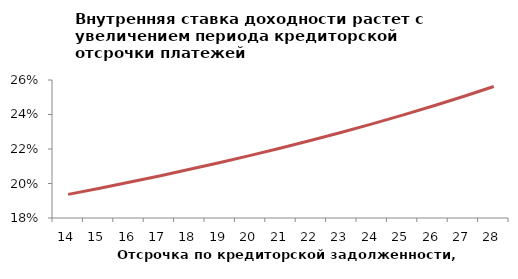
| Category | Series 1 |
|---|---|
| 14.0 | 0.194 |
| 15.0 | 0.197 |
| 16.0 | 0.201 |
| 17.0 | 0.204 |
| 18.0 | 0.208 |
| 19.0 | 0.212 |
| 20.0 | 0.216 |
| 21.0 | 0.221 |
| 22.0 | 0.225 |
| 23.0 | 0.23 |
| 24.0 | 0.235 |
| 25.0 | 0.24 |
| 26.0 | 0.245 |
| 27.0 | 0.25 |
| 28.0 | 0.256 |